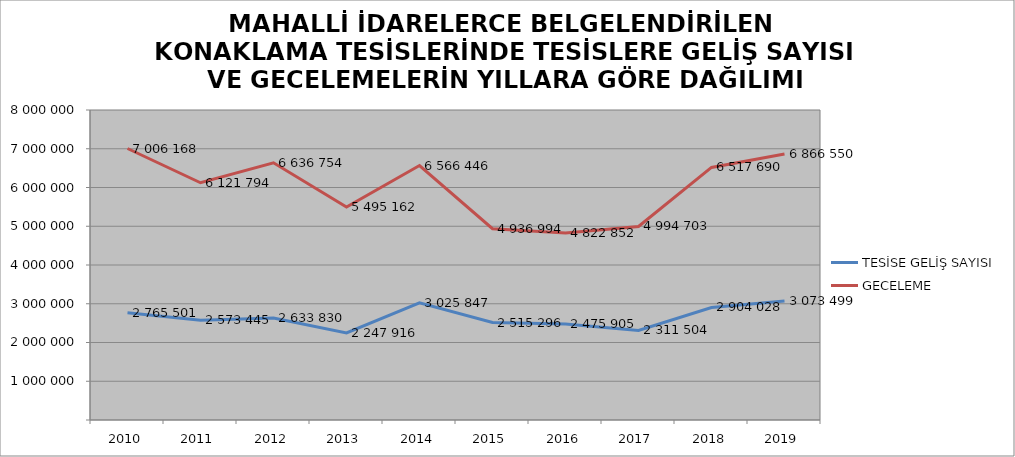
| Category | TESİSE GELİŞ SAYISI | GECELEME |
|---|---|---|
| 2010 | 2765501 | 7006168 |
| 2011 | 2573445 | 6121794 |
| 2012 | 2633830 | 6636754 |
| 2013 | 2247916 | 5495162 |
| 2014 | 3025847 | 6566446 |
| 2015 | 2515296 | 4936994 |
| 2016 | 2475905 | 4822852 |
| 2017 | 2311504 | 4994703 |
| 2018 | 2904028 | 6517690 |
| 2019 | 3073499 | 6866550 |